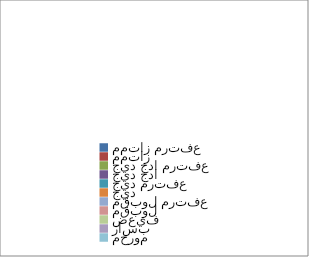
| Category | Series 0 |
|---|---|
| ممتاز مرتفع  | 0 |
| ممتاز   | 0 |
| جيد جدا مرتفع | 0 |
| جيد جدا  | 0 |
| جيد مرتفع  | 0 |
| جيد | 0 |
| مقبول مرتفع | 0 |
| مقبول   | 0 |
| ضعيف | 0 |
| راسب | 0 |
| محروم | 0 |